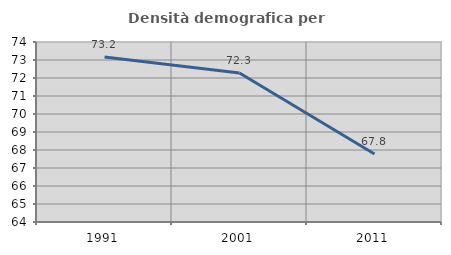
| Category | Densità demografica |
|---|---|
| 1991.0 | 73.172 |
| 2001.0 | 72.28 |
| 2011.0 | 67.781 |